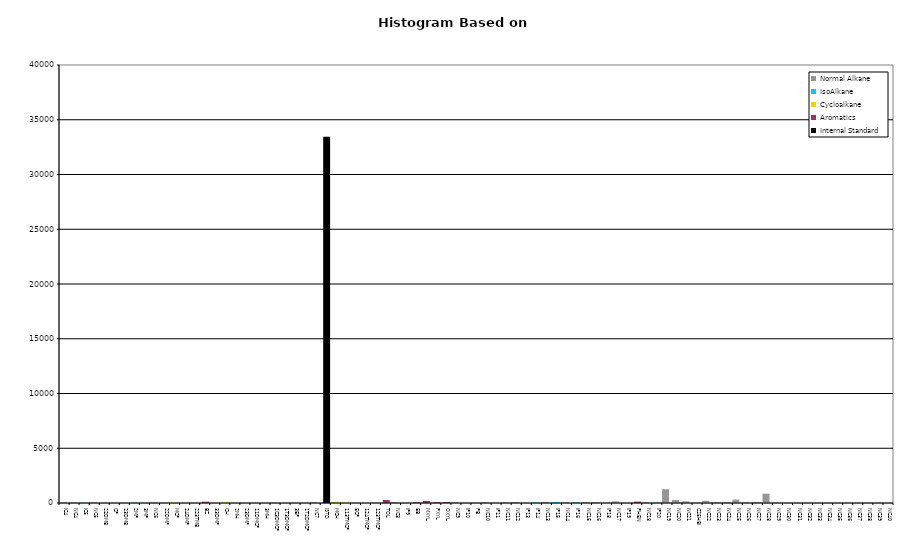
| Category | Normal Alkane | IsoAlkane | Cycloalkane | Aromatics | Internal Standard |
|---|---|---|---|---|---|
| IC4 | 0 | 40 | 0 | 0 | 0 |
| NC4 | 48 | 0 | 0 | 0 | 0 |
| IC5 | 0 | 27 | 0 | 0 | 0 |
| NC5 | 50 | 0 | 0 | 0 | 0 |
| 22DMB | 0 | 0 | 0 | 0 | 0 |
| CP | 0 | 0 | 0 | 0 | 0 |
| 23DMB | 0 | 0 | 0 | 0 | 0 |
| 2MP | 0 | 24 | 0 | 0 | 0 |
| 3MP | 0 | 20 | 0 | 0 | 0 |
| NC6 | 52 | 0 | 0 | 0 | 0 |
| 22DMP | 0 | 0 | 0 | 0 | 0 |
| MCP | 0 | 0 | 56 | 0 | 0 |
| 24DMP | 0 | 0 | 0 | 0 | 0 |
| 223TMB | 0 | 0 | 0 | 0 | 0 |
| BZ | 0 | 0 | 0 | 122 | 0 |
| 33DMP | 0 | 0 | 0 | 0 | 0 |
| CH | 0 | 0 | 69 | 0 | 0 |
| 2MH | 0 | 0 | 0 | 0 | 0 |
| 23DMP | 0 | 0 | 0 | 0 | 0 |
| 11DMCP | 0 | 0 | 0 | 0 | 0 |
| 3MH | 0 | 0 | 0 | 0 | 0 |
| 1C3DMCP | 0 | 0 | 0 | 0 | 0 |
| 1T3DMCP | 0 | 0 | 0 | 0 | 0 |
| 3EP | 0 | 0 | 0 | 0 | 0 |
| 1T2DMCP | 0 | 0 | 0 | 0 | 0 |
| NC7 | 59 | 0 | 0 | 0 | 0 |
| ISTD | 0 | 0 | 0 | 0 | 33452 |
| MCH | 0 | 0 | 110 | 0 | 0 |
| 113TMCP | 0 | 0 | 33 | 0 | 0 |
| ECP | 0 | 0 | 0 | 0 | 0 |
| 124TMCP | 0 | 0 | 0 | 0 | 0 |
| 123TMCP | 0 | 0 | 0 | 0 | 0 |
| TOL | 0 | 0 | 0 | 275 | 0 |
| NC8 | 85 | 0 | 0 | 0 | 0 |
| IP9 | 0 | 0 | 0 | 0 | 0 |
| EB | 0 | 0 | 0 | 61 | 0 |
| MXYL | 0 | 0 | 0 | 195 | 0 |
| PXYL | 0 | 0 | 0 | 84 | 0 |
| OXYL | 0 | 0 | 0 | 95 | 0 |
| NC9 | 71 | 0 | 0 | 0 | 0 |
| IP10 | 0 | 0 | 0 | 0 | 0 |
| PB | 0 | 0 | 0 | 0 | 0 |
| NC10 | 69 | 0 | 0 | 0 | 0 |
| IP11 | 0 | 0 | 0 | 0 | 0 |
| NC11 | 66 | 0 | 0 | 0 | 0 |
| NC12 | 81 | 0 | 0 | 0 | 0 |
| IP13 | 0 | 0 | 0 | 0 | 0 |
| IP14 | 0 | 42 | 0 | 0 | 0 |
| NC13 | 106 | 0 | 0 | 0 | 0 |
| IP15 | 0 | 85 | 0 | 0 | 0 |
| NC14 | 76 | 0 | 0 | 0 | 0 |
| IP16 | 0 | 68 | 0 | 0 | 0 |
| NC15 | 77 | 0 | 0 | 0 | 0 |
| NC16 | 75 | 0 | 0 | 0 | 0 |
| IP18 | 0 | 0 | 0 | 0 | 0 |
| NC17 | 146 | 0 | 0 | 0 | 0 |
| IP19 | 0 | 0 | 0 | 0 | 0 |
| PHEN | 0 | 0 | 0 | 126 | 0 |
| NC18 | 87 | 0 | 0 | 0 | 0 |
| IP20 | 0 | 39 | 0 | 0 | 0 |
| NC19 | 1258 | 0 | 0 | 0 | 0 |
| NC20 | 278 | 0 | 0 | 0 | 0 |
| NC21 | 151 | 0 | 0 | 0 | 0 |
| C25HBI | 0 | 0 | 0 | 0 | 0 |
| NC22 | 204 | 0 | 0 | 0 | 0 |
| NC23 | 76 | 0 | 0 | 0 | 0 |
| NC24 | 87 | 0 | 0 | 0 | 0 |
| NC25 | 314 | 0 | 0 | 0 | 0 |
| NC26 | 57 | 0 | 0 | 0 | 0 |
| NC27 | 86 | 0 | 0 | 0 | 0 |
| NC28 | 853 | 0 | 0 | 0 | 0 |
| NC29 | 43 | 0 | 0 | 0 | 0 |
| NC30 | 0 | 0 | 0 | 0 | 0 |
| NC31 | 0 | 0 | 0 | 0 | 0 |
| NC32 | 0 | 0 | 0 | 0 | 0 |
| NC33 | 0 | 0 | 0 | 0 | 0 |
| NC34 | 0 | 0 | 0 | 0 | 0 |
| NC35 | 0 | 0 | 0 | 0 | 0 |
| NC36 | 0 | 0 | 0 | 0 | 0 |
| NC37 | 0 | 0 | 0 | 0 | 0 |
| NC38 | 0 | 0 | 0 | 0 | 0 |
| NC39 | 0 | 0 | 0 | 0 | 0 |
| NC40 | 0 | 0 | 0 | 0 | 0 |